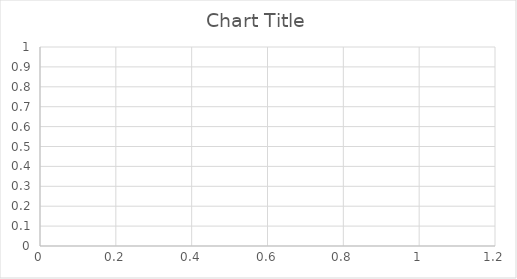
| Category | Series 0 |
|---|---|
|  | 0 |
|  | 30 |